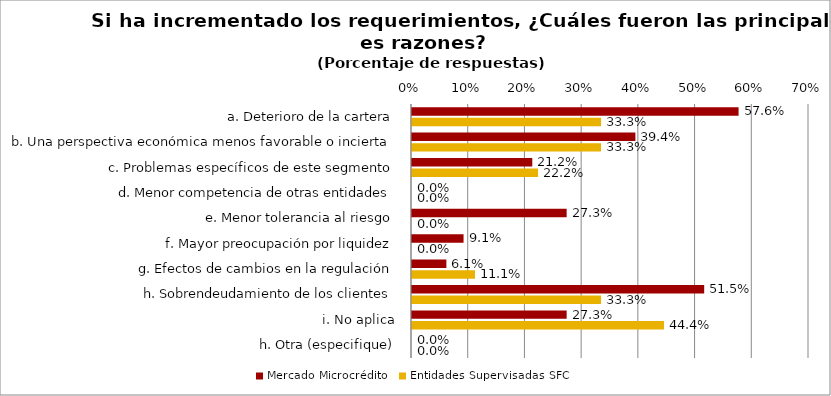
| Category | Mercado Microcrédito | Entidades Supervisadas SFC |
|---|---|---|
| a. Deterioro de la cartera | 0.576 | 0.333 |
| b. Una perspectiva económica menos favorable o incierta | 0.394 | 0.333 |
| c. Problemas específicos de este segmento | 0.212 | 0.222 |
| d. Menor competencia de otras entidades | 0 | 0 |
| e. Menor tolerancia al riesgo | 0.273 | 0 |
| f. Mayor preocupación por liquidez | 0.091 | 0 |
| g. Efectos de cambios en la regulación | 0.061 | 0.111 |
| h. Sobrendeudamiento de los clientes | 0.515 | 0.333 |
| i. No aplica | 0.273 | 0.444 |
| h. Otra (especifique) | 0 | 0 |